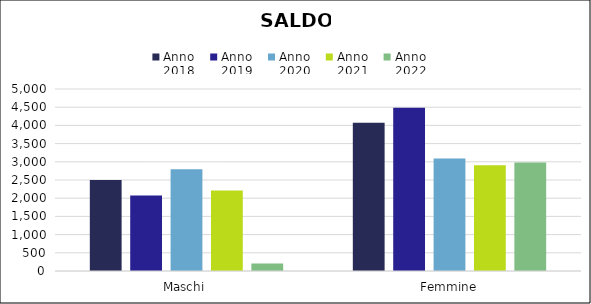
| Category | Anno
2018 | Anno
2019 | Anno
2020 | Anno
2021 | Anno
2022 |
|---|---|---|---|---|---|
| Maschi | 2501 | 2076 | 2792 | 2210 | 209 |
| Femmine | 4070 | 4487 | 3093 | 2908 | 2983 |